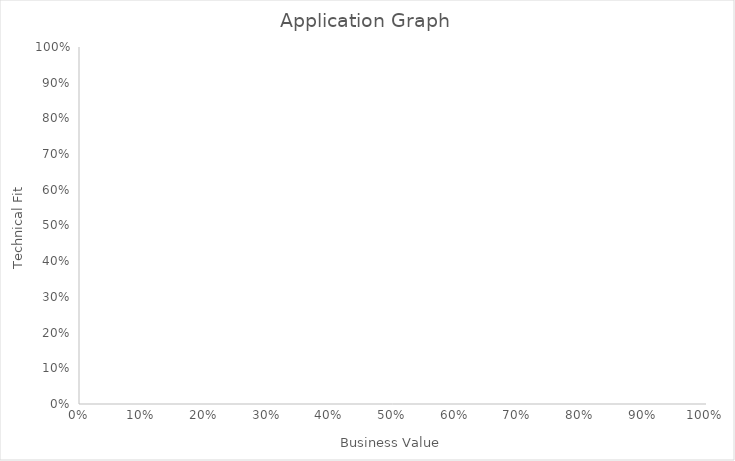
| Category | Matrix |
|---|---|
| 0.0 | 0 |
| 0.0 | 0 |
| 0.0 | 0 |
| 0.0 | 0 |
| 0.0 | 0 |
| 0.0 | 0 |
| 0.0 | 0 |
| 0.0 | 0 |
| 0.0 | 0 |
| 0.0 | 0 |
| 0.0 | 0 |
| 0.0 | 0 |
| 0.0 | 0 |
| 0.0 | 0 |
| 0.0 | 0 |
| 0.0 | 0 |
| 0.0 | 0 |
| 0.0 | 0 |
| 0.0 | 0 |
| 0.0 | 0 |